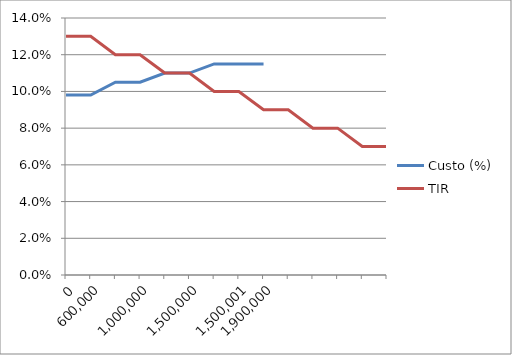
| Category | Custo (%) | TIR |
|---|---|---|
| 0.0 | 0.098 | 0.13 |
| 600000.0 | 0.098 | 0.13 |
| nan | 0.105 | 0.12 |
| 1000000.0 | 0.105 | 0.12 |
| nan | 0.11 | 0.11 |
| 1500000.0 | 0.11 | 0.11 |
| nan | 0.115 | 0.1 |
| 1500001.0 | 0.115 | 0.1 |
| 1900000.0 | 0.115 | 0.09 |